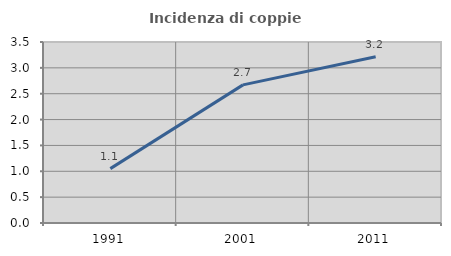
| Category | Incidenza di coppie miste |
|---|---|
| 1991.0 | 1.052 |
| 2001.0 | 2.671 |
| 2011.0 | 3.215 |